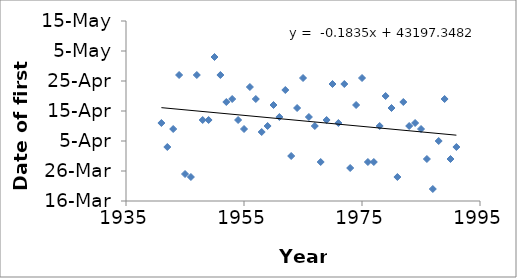
| Category | Series 0 |
|---|---|
| 1941.0 | 2017-04-11 |
| 1942.0 | 2017-04-03 |
| 1943.0 | 2017-04-09 |
| 1944.0 | 2017-04-27 |
| 1945.0 | 2017-03-25 |
| 1946.0 | 2017-03-24 |
| 1947.0 | 2017-04-27 |
| 1948.0 | 2017-04-12 |
| 1949.0 | 2017-04-12 |
| 1950.0 | 2017-05-03 |
| 1951.0 | 2017-04-27 |
| 1952.0 | 2017-04-18 |
| 1953.0 | 2017-04-19 |
| 1954.0 | 2017-04-12 |
| 1955.0 | 2017-04-09 |
| 1956.0 | 2017-04-23 |
| 1957.0 | 2017-04-19 |
| 1958.0 | 2017-04-08 |
| 1959.0 | 2017-04-10 |
| 1960.0 | 2017-04-17 |
| 1961.0 | 2017-04-13 |
| 1962.0 | 2017-04-22 |
| 1963.0 | 2017-03-31 |
| 1964.0 | 2017-04-16 |
| 1965.0 | 2017-04-26 |
| 1966.0 | 2017-04-13 |
| 1967.0 | 2017-04-10 |
| 1968.0 | 2017-03-29 |
| 1969.0 | 2017-04-12 |
| 1970.0 | 2017-04-24 |
| 1971.0 | 2017-04-11 |
| 1972.0 | 2017-04-24 |
| 1973.0 | 2017-03-27 |
| 1974.0 | 2017-04-17 |
| 1975.0 | 2017-04-26 |
| 1976.0 | 2017-03-29 |
| 1977.0 | 2017-03-29 |
| 1978.0 | 2017-04-10 |
| 1979.0 | 2017-04-20 |
| 1980.0 | 2017-04-16 |
| 1981.0 | 2017-03-24 |
| 1982.0 | 2017-04-18 |
| 1983.0 | 2017-04-10 |
| 1984.0 | 2017-04-11 |
| 1985.0 | 2017-04-09 |
| 1986.0 | 2017-03-30 |
| 1987.0 | 2017-03-20 |
| 1988.0 | 2017-04-05 |
| 1989.0 | 2017-04-19 |
| 1990.0 | 2017-03-30 |
| 1991.0 | 2017-04-03 |